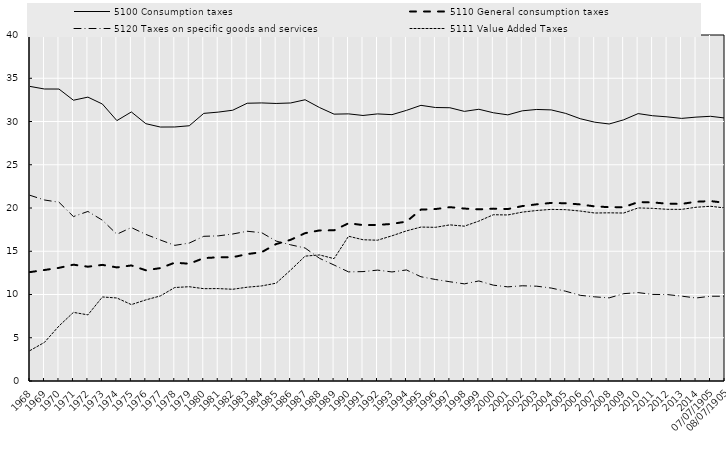
| Category | 5100 Consumption taxes | 5110 General consumption taxes | 5120 Taxes on specific goods and services | 5111 Value Added Taxes |
|---|---|---|---|---|
| 1968 | 34.057 | 12.589 | 21.468 | 3.518 |
| 1969 | 33.757 | 12.832 | 20.925 | 4.467 |
| 1970 | 33.753 | 13.081 | 20.668 | 6.356 |
| 1971 | 32.46 | 13.448 | 19.01 | 7.933 |
| 1972 | 32.817 | 13.214 | 19.601 | 7.646 |
| 1973 | 32.019 | 13.426 | 18.59 | 9.716 |
| 1974 | 30.104 | 13.132 | 16.969 | 9.596 |
| 1975 | 31.103 | 13.359 | 17.74 | 8.833 |
| 1976 | 29.748 | 12.797 | 16.948 | 9.376 |
| 1977 | 29.359 | 13.052 | 16.302 | 9.834 |
| 1978 | 29.367 | 13.682 | 15.681 | 10.808 |
| 1979 | 29.507 | 13.557 | 15.947 | 10.899 |
| 1980 | 30.939 | 14.204 | 16.727 | 10.674 |
| 1981 | 31.085 | 14.305 | 16.778 | 10.683 |
| 1982 | 31.303 | 14.31 | 16.993 | 10.606 |
| 1983 | 32.111 | 14.67 | 17.311 | 10.844 |
| 1984 | 32.146 | 14.894 | 17.144 | 10.992 |
| 1985 | 32.085 | 15.829 | 16.177 | 11.308 |
| 1986 | 32.141 | 16.323 | 15.743 | 12.822 |
| 1987 | 32.513 | 17.092 | 15.375 | 14.436 |
| 1988 | 31.611 | 17.41 | 14.178 | 14.574 |
| 1989 | 30.849 | 17.417 | 13.407 | 14.144 |
| 1990 | 30.882 | 18.242 | 12.615 | 16.736 |
| 1991 | 30.696 | 18.023 | 12.648 | 16.33 |
| 1992 | 30.878 | 18.039 | 12.819 | 16.276 |
| 1993 | 30.79 | 18.163 | 12.607 | 16.786 |
| 1994 | 31.287 | 18.429 | 12.838 | 17.353 |
| 1995 | 31.869 | 19.812 | 12.051 | 17.796 |
| 1996 | 31.618 | 19.877 | 11.736 | 17.766 |
| 1997 | 31.59 | 20.099 | 11.473 | 18.051 |
| 1998 | 31.17 | 19.936 | 11.229 | 17.9 |
| 1999 | 31.416 | 19.844 | 11.566 | 18.486 |
| 2000 | 31.011 | 19.928 | 11.079 | 19.221 |
| 2001 | 30.767 | 19.879 | 10.882 | 19.196 |
| 2002 | 31.234 | 20.221 | 11.008 | 19.523 |
| 2003 | 31.391 | 20.426 | 10.96 | 19.712 |
| 2004 | 31.339 | 20.587 | 10.746 | 19.842 |
| 2005 | 30.934 | 20.55 | 10.377 | 19.807 |
| 2006 | 30.324 | 20.412 | 9.905 | 19.648 |
| 2007 | 29.922 | 20.185 | 9.73 | 19.42 |
| 2008 | 29.712 | 20.097 | 9.61 | 19.442 |
| 2009 | 30.195 | 20.093 | 10.096 | 19.418 |
| 2010 | 30.913 | 20.683 | 10.22 | 20.007 |
| 2011 | 30.668 | 20.644 | 10.007 | 19.962 |
| 2012 | 30.538 | 20.502 | 9.993 | 19.849 |
| 2013 | 30.359 | 20.472 | 9.812 | 19.842 |
| 2014 | 30.506 | 20.724 | 9.596 | 20.086 |
| 2015 | 30.6 | 20.8 | 9.8 | 20.2 |
| 2016 | 30.4 | 20.6 | 9.8 | 20 |